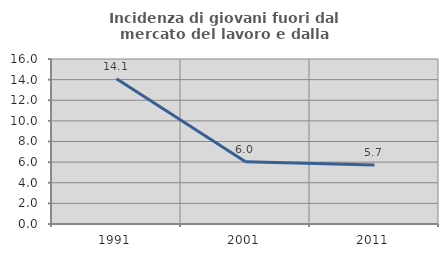
| Category | Incidenza di giovani fuori dal mercato del lavoro e dalla formazione  |
|---|---|
| 1991.0 | 14.085 |
| 2001.0 | 6.047 |
| 2011.0 | 5.729 |